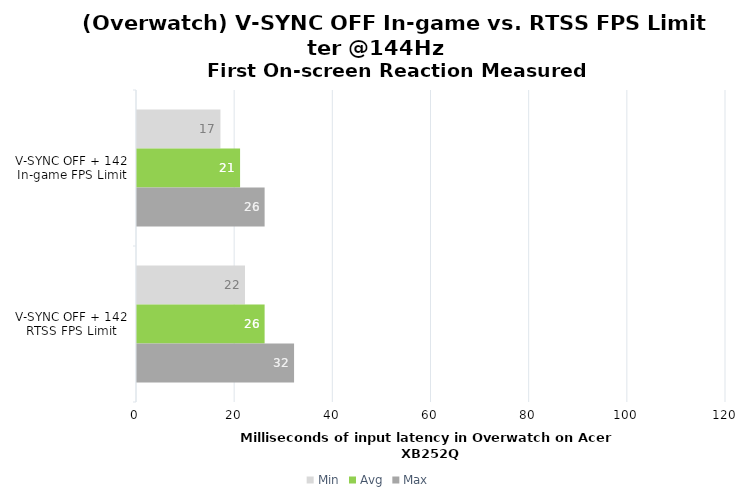
| Category | Min | Avg | Max |
|---|---|---|---|
| V-SYNC OFF + 142 In-game FPS Limit | 17 | 21 | 26 |
| V-SYNC OFF + 142 RTSS FPS Limit | 22 | 26 | 32 |